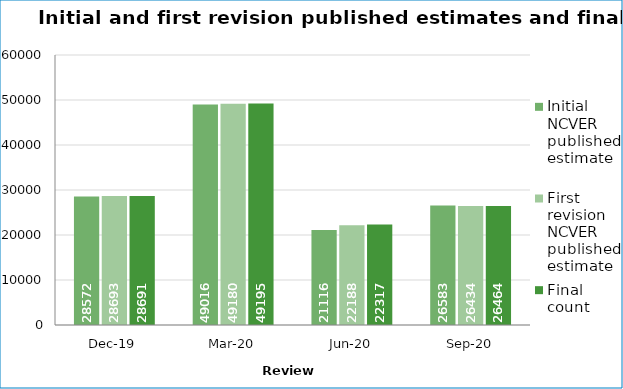
| Category | Initial NCVER published estimate | First revision NCVER published estimate | Final count |
|---|---|---|---|
| 2019-12-01 | 28572 | 28693 | 28691 |
| 2020-03-01 | 49016 | 49180 | 49195 |
| 2020-06-01 | 21116 | 22188 | 22317 |
| 2020-09-01 | 26583 | 26434 | 26464 |